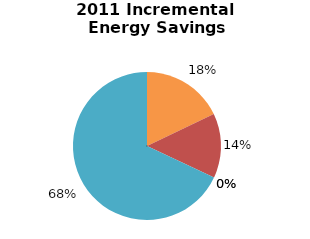
| Category | Incremental Energy Savings (kWh) |
|---|---|
| Consumer Program Total | 174513.858 |
| Business Program Total | 137122.08 |
| Industrial Program Total | 0 |
| Home Assistance Program Total | 0 |
| Pre-2011 Programs completed in 2011 Total | 662940.829 |